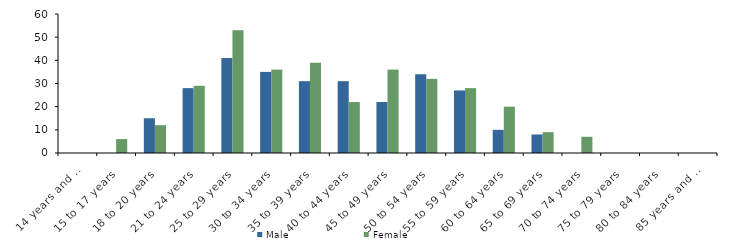
| Category | Male | Female |
|---|---|---|
| 14 years and under | 0 | 0 |
| 15 to 17 years | 0 | 6 |
| 18 to 20 years | 15 | 12 |
| 21 to 24 years | 28 | 29 |
| 25 to 29 years | 41 | 53 |
| 30 to 34 years | 35 | 36 |
| 35 to 39 years | 31 | 39 |
| 40 to 44 years | 31 | 22 |
| 45 to 49 years | 22 | 36 |
| 50 to 54 years | 34 | 32 |
| 55 to 59 years | 27 | 28 |
| 60 to 64 years | 10 | 20 |
| 65 to 69 years | 8 | 9 |
| 70 to 74 years | 0 | 7 |
| 75 to 79 years | 0 | 0 |
| 80 to 84 years | 0 | 0 |
| 85 years and over | 0 | 0 |